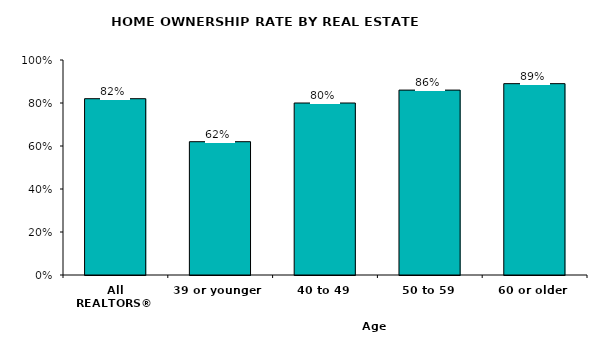
| Category | Series 0 |
|---|---|
| All REALTORS® | 82 |
| 39 or younger | 62 |
| 40 to 49 | 80 |
| 50 to 59 | 86 |
| 60 or older | 89 |